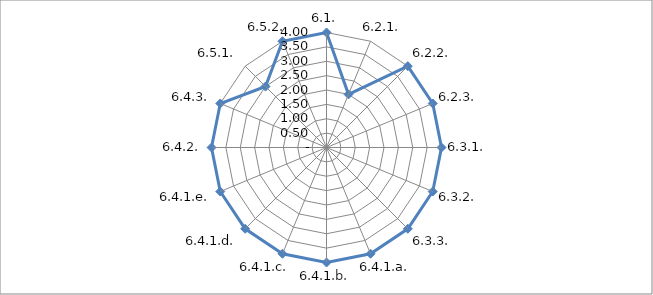
| Category | Series 0 |
|---|---|
| 6.1. | 4 |
| 6.2.1. | 2 |
| 6.2.2. | 4 |
| 6.2.3. | 4 |
| 6.3.1. | 4 |
| 6.3.2. | 4 |
| 6.3.3. | 4 |
| 6.4.1.a. | 4 |
| 6.4.1.b. | 4 |
| 6.4.1.c. | 4 |
| 6.4.1.d. | 4 |
| 6.4.1.e. | 4 |
| 6.4.2. | 4 |
| 6.4.3. | 4 |
| 6.5.1. | 3 |
| 6.5.2. | 4 |